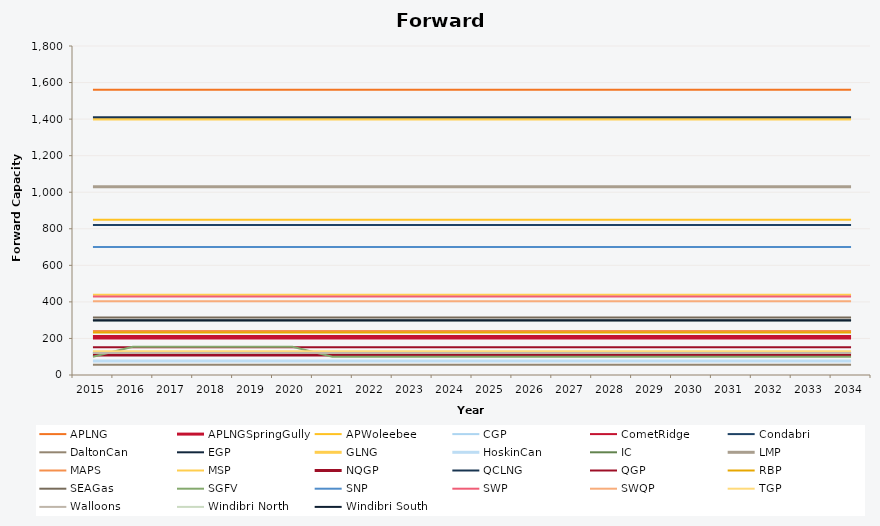
| Category | APLNG | APLNGSpringGully | APWoleebee | CGP | CometRidge | Condabri | DaltonCan | EGP | GLNG | HoskinCan | IC | LMP | MAPS | MSP | NQGP | QCLNG | QGP | RBP | SEAGas | SGFV | SNP | SWP | SWQP | TGP | Walloons | Windibri North | Windibri South |
|---|---|---|---|---|---|---|---|---|---|---|---|---|---|---|---|---|---|---|---|---|---|---|---|---|---|---|---|
| 2015.0 | 1560 | 210 | 850 | 119 | 200 | 820 | 56 | 298 | 1400 | 77 | 120 | 1030 | 241 | 439 | 110 | 1410 | 152 | 233 | 314 | 100 | 700 | 429 | 404 | 130 | 120 | 300 | 300 |
| 2016.0 | 1560 | 210 | 850 | 119 | 200 | 820 | 56 | 298 | 1400 | 77 | 120 | 1030 | 241 | 439 | 110 | 1410 | 152 | 233 | 314 | 155 | 700 | 429 | 404 | 130 | 120 | 300 | 300 |
| 2017.0 | 1560 | 210 | 850 | 119 | 200 | 820 | 56 | 298 | 1400 | 77 | 120 | 1030 | 241 | 439 | 110 | 1410 | 152 | 233 | 314 | 155 | 700 | 429 | 404 | 130 | 120 | 300 | 300 |
| 2018.0 | 1560 | 210 | 850 | 119 | 200 | 820 | 56 | 298 | 1400 | 77 | 120 | 1030 | 241 | 439 | 110 | 1410 | 152 | 233 | 314 | 155 | 700 | 429 | 404 | 130 | 120 | 300 | 300 |
| 2019.0 | 1560 | 210 | 850 | 119 | 200 | 820 | 56 | 298 | 1400 | 77 | 120 | 1030 | 241 | 439 | 110 | 1410 | 152 | 233 | 314 | 155 | 700 | 429 | 404 | 130 | 120 | 300 | 300 |
| 2020.0 | 1560 | 210 | 850 | 119 | 200 | 820 | 56 | 298 | 1400 | 77 | 120 | 1030 | 241 | 439 | 110 | 1410 | 152 | 233 | 314 | 155 | 700 | 429 | 404 | 130 | 120 | 300 | 300 |
| 2021.0 | 1560 | 210 | 850 | 119 | 200 | 820 | 56 | 298 | 1400 | 77 | 120 | 1030 | 241 | 439 | 110 | 1410 | 152 | 233 | 314 | 100 | 700 | 429 | 404 | 130 | 120 | 300 | 300 |
| 2022.0 | 1560 | 210 | 850 | 119 | 200 | 820 | 56 | 298 | 1400 | 77 | 120 | 1030 | 241 | 439 | 110 | 1410 | 152 | 233 | 314 | 100 | 700 | 429 | 404 | 130 | 120 | 300 | 300 |
| 2023.0 | 1560 | 210 | 850 | 119 | 200 | 820 | 56 | 298 | 1400 | 77 | 120 | 1030 | 241 | 439 | 110 | 1410 | 152 | 233 | 314 | 100 | 700 | 429 | 404 | 130 | 120 | 300 | 300 |
| 2024.0 | 1560 | 210 | 850 | 119 | 200 | 820 | 56 | 298 | 1400 | 77 | 120 | 1030 | 241 | 439 | 110 | 1410 | 152 | 233 | 314 | 100 | 700 | 429 | 404 | 130 | 120 | 300 | 300 |
| 2025.0 | 1560 | 210 | 850 | 119 | 200 | 820 | 56 | 298 | 1400 | 77 | 120 | 1030 | 241 | 439 | 110 | 1410 | 152 | 233 | 314 | 100 | 700 | 429 | 404 | 130 | 120 | 300 | 300 |
| 2026.0 | 1560 | 210 | 850 | 119 | 200 | 820 | 56 | 298 | 1400 | 77 | 120 | 1030 | 241 | 439 | 110 | 1410 | 152 | 233 | 314 | 100 | 700 | 429 | 404 | 130 | 120 | 300 | 300 |
| 2027.0 | 1560 | 210 | 850 | 119 | 200 | 820 | 56 | 298 | 1400 | 77 | 120 | 1030 | 241 | 439 | 110 | 1410 | 152 | 233 | 314 | 100 | 700 | 429 | 404 | 130 | 120 | 300 | 300 |
| 2028.0 | 1560 | 210 | 850 | 119 | 200 | 820 | 56 | 298 | 1400 | 77 | 120 | 1030 | 241 | 439 | 110 | 1410 | 152 | 233 | 314 | 100 | 700 | 429 | 404 | 130 | 120 | 300 | 300 |
| 2029.0 | 1560 | 210 | 850 | 119 | 200 | 820 | 56 | 298 | 1400 | 77 | 120 | 1030 | 241 | 439 | 110 | 1410 | 152 | 233 | 314 | 100 | 700 | 429 | 404 | 130 | 120 | 300 | 300 |
| 2030.0 | 1560 | 210 | 850 | 119 | 200 | 820 | 56 | 298 | 1400 | 77 | 120 | 1030 | 241 | 439 | 110 | 1410 | 152 | 233 | 314 | 100 | 700 | 429 | 404 | 130 | 120 | 300 | 300 |
| 2031.0 | 1560 | 210 | 850 | 119 | 200 | 820 | 56 | 298 | 1400 | 77 | 120 | 1030 | 241 | 439 | 110 | 1410 | 152 | 233 | 314 | 100 | 700 | 429 | 404 | 130 | 120 | 300 | 300 |
| 2032.0 | 1560 | 210 | 850 | 119 | 200 | 820 | 56 | 298 | 1400 | 77 | 120 | 1030 | 241 | 439 | 110 | 1410 | 152 | 233 | 314 | 100 | 700 | 429 | 404 | 130 | 120 | 300 | 300 |
| 2033.0 | 1560 | 210 | 850 | 119 | 200 | 820 | 56 | 298 | 1400 | 77 | 120 | 1030 | 241 | 439 | 110 | 1410 | 152 | 233 | 314 | 100 | 700 | 429 | 404 | 130 | 120 | 300 | 300 |
| 2034.0 | 1560 | 210 | 850 | 119 | 200 | 820 | 56 | 298 | 1400 | 77 | 120 | 1030 | 241 | 439 | 110 | 1410 | 152 | 233 | 314 | 100 | 700 | 429 | 404 | 130 | 120 | 300 | 300 |